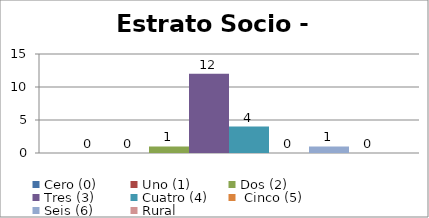
| Category | Cero (0) | Uno (1)   | Dos (2) | Tres (3) | Cuatro (4) |  Cinco (5) | Seis (6) | Rural |
|---|---|---|---|---|---|---|---|---|
| 0 | 0 | 0 | 1 | 12 | 4 | 0 | 1 | 0 |